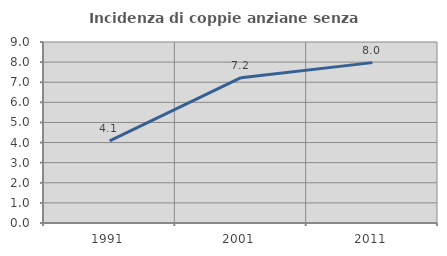
| Category | Incidenza di coppie anziane senza figli  |
|---|---|
| 1991.0 | 4.082 |
| 2001.0 | 7.224 |
| 2011.0 | 7.975 |